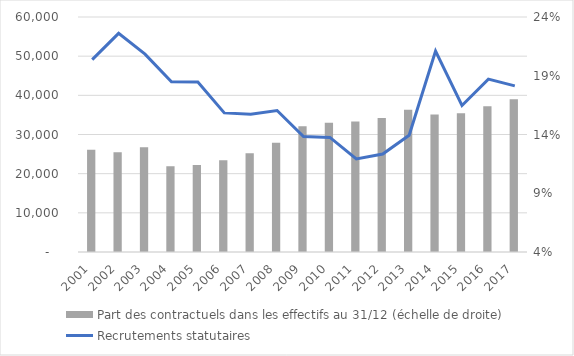
| Category | Part des contractuels dans les effectifs au 31/12 (échelle de droite) |
|---|---|
| 2001.0 | 0.127 |
| 2002.0 | 0.125 |
| 2003.0 | 0.129 |
| 2004.0 | 0.113 |
| 2005.0 | 0.114 |
| 2006.0 | 0.118 |
| 2007.0 | 0.124 |
| 2008.0 | 0.133 |
| 2009.0 | 0.147 |
| 2010.0 | 0.15 |
| 2011.0 | 0.151 |
| 2012.0 | 0.154 |
| 2013.0 | 0.161 |
| 2014.0 | 0.157 |
| 2015.0 | 0.158 |
| 2016.0 | 0.164 |
| 2017.0 | 0.17 |